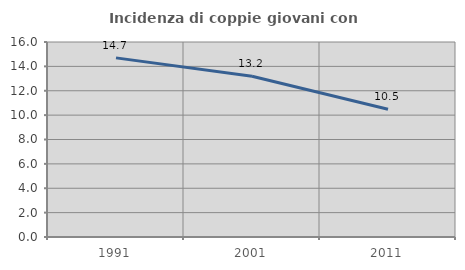
| Category | Incidenza di coppie giovani con figli |
|---|---|
| 1991.0 | 14.696 |
| 2001.0 | 13.196 |
| 2011.0 | 10.476 |